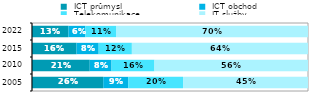
| Category |  ICT průmysl |  ICT obchod |  Telekomunikace |  IT služby  |
|---|---|---|---|---|
| 2005.0 | 0.258 | 0.09 | 0.199 | 0.453 |
| 2010.0 | 0.209 | 0.079 | 0.156 | 0.556 |
| 2015.0 | 0.161 | 0.08 | 0.12 | 0.638 |
| 2022.0 | 0.132 | 0.062 | 0.111 | 0.696 |